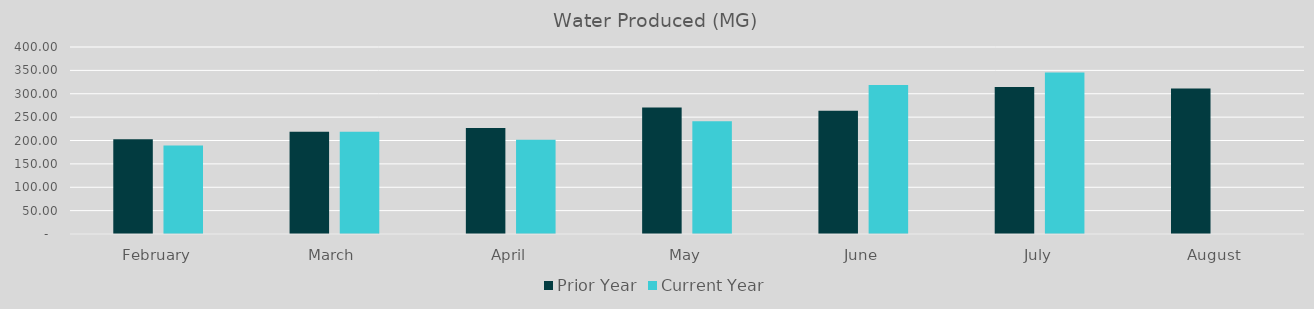
| Category | Prior Year | Current Year |
|---|---|---|
| February | 202.92 | 189.14 |
| March | 218.89 | 218.9 |
| April | 226.62 | 201.4 |
| May | 270.85 | 241.3 |
| June | 263.67 | 318.9 |
| July | 314.55 | 345.4 |
| August | 311.17 | 0 |